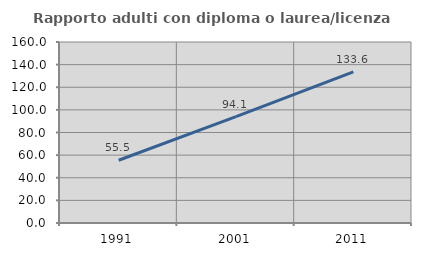
| Category | Rapporto adulti con diploma o laurea/licenza media  |
|---|---|
| 1991.0 | 55.468 |
| 2001.0 | 94.05 |
| 2011.0 | 133.572 |